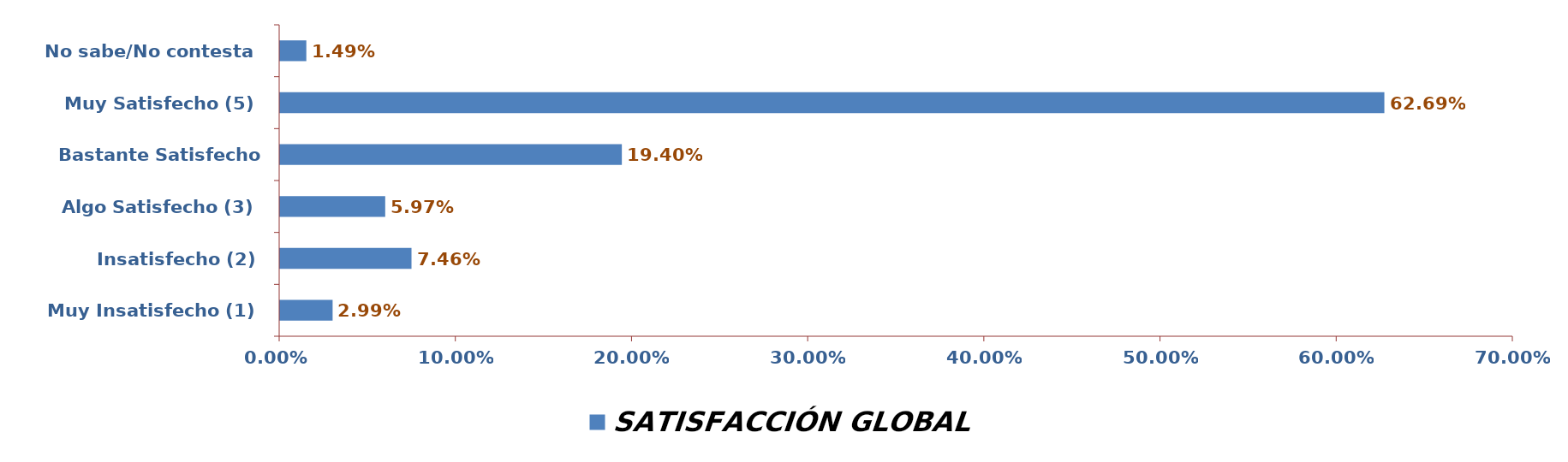
| Category | SATISFACCIÓN GLOBAL |
|---|---|
| Muy Insatisfecho (1) | 0.03 |
| Insatisfecho (2) | 0.075 |
| Algo Satisfecho (3) | 0.06 |
| Bastante Satisfecho (4) | 0.194 |
| Muy Satisfecho (5) | 0.627 |
| No sabe/No contesta | 0.015 |